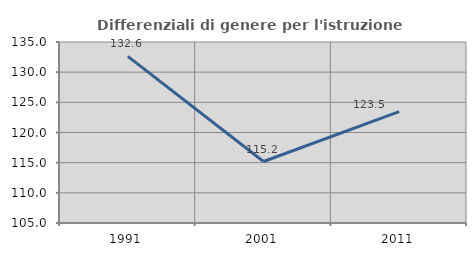
| Category | Differenziali di genere per l'istruzione superiore |
|---|---|
| 1991.0 | 132.61 |
| 2001.0 | 115.191 |
| 2011.0 | 123.468 |